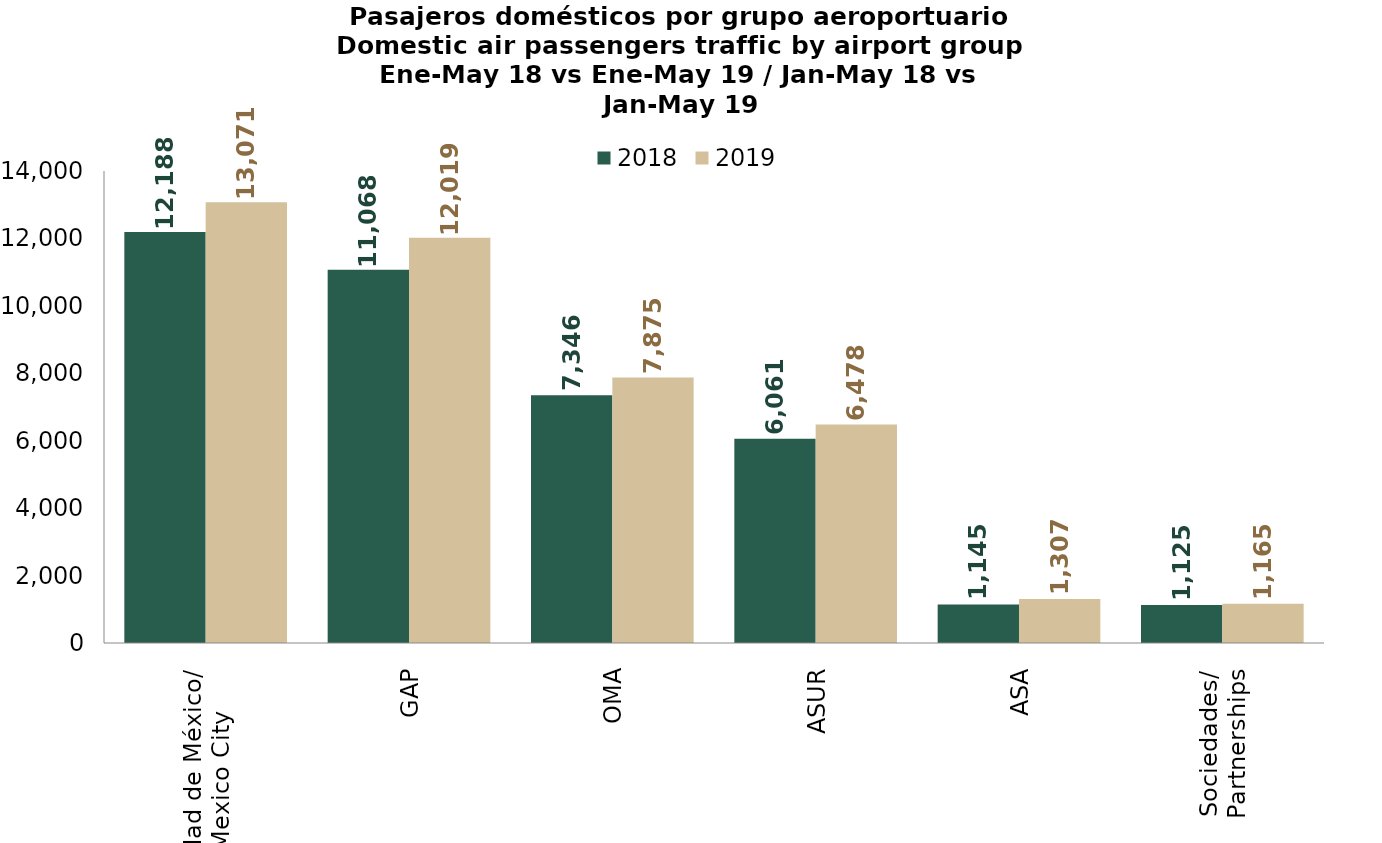
| Category | 2018 | 2019 |
|---|---|---|
| Ciudad de México/
Mexico City | 12187.848 | 13071.022 |
| GAP | 11067.528 | 12018.652 |
| OMA | 7345.824 | 7874.756 |
| ASUR | 6060.848 | 6477.882 |
| ASA | 1144.801 | 1306.826 |
| Sociedades/
Partnerships | 1125.314 | 1164.886 |